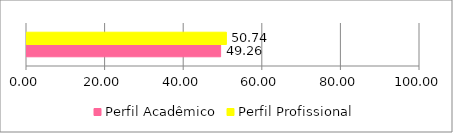
| Category | Perfil Acadêmico | Perfil Profissional |
|---|---|---|
| 0 | 49.265 | 50.735 |